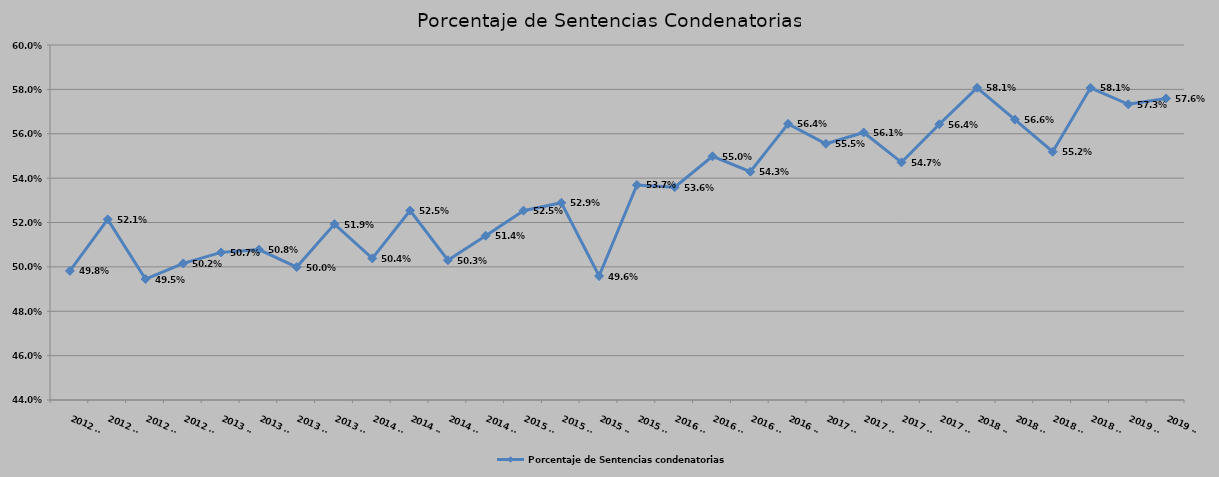
| Category | Porcentaje de Sentencias condenatorias |
|---|---|
| 2012 T1 | 0.498 |
| 2012 T2 | 0.521 |
| 2012 T3 | 0.495 |
| 2012 T4 | 0.502 |
| 2013 T1 | 0.507 |
| 2013 T2 | 0.508 |
| 2013 T3 | 0.5 |
| 2013 T4 | 0.519 |
| 2014 T1 | 0.504 |
| 2014 T2 | 0.525 |
| 2014 T3 | 0.503 |
| 2014 T4 | 0.514 |
| 2015 T1 | 0.525 |
| 2015 T2 | 0.529 |
| 2015 T3 | 0.496 |
| 2015 T4 | 0.537 |
| 2016 T1 | 0.536 |
| 2016 T2 | 0.55 |
| 2016 T3 | 0.543 |
| 2016 T4 | 0.564 |
| 2017 T1 | 0.555 |
| 2017 T2 | 0.561 |
| 2017 T3 | 0.547 |
| 2017 T4 | 0.564 |
| 2018 T1 | 0.581 |
| 2018 T2 | 0.566 |
| 2018 T3 | 0.552 |
| 2018 T4 | 0.581 |
| 2019 T1 | 0.573 |
| 2019 T2 | 0.576 |